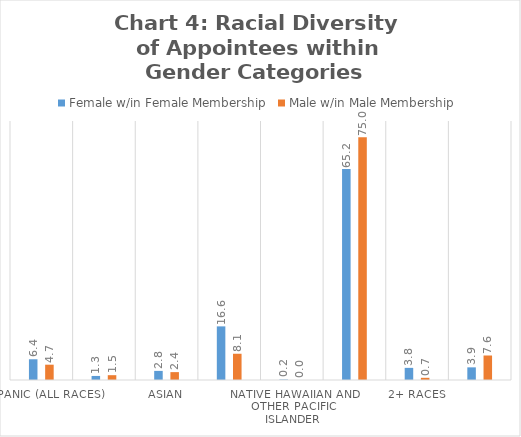
| Category | Female w/in Female Membership | Male w/in Male Membership |
|---|---|---|
| Hispanic (all races) | 6.406 | 4.73 |
| American Indian and Alaskan Native | 1.25 | 1.486 |
| Asian | 2.812 | 2.432 |
| Black and African American (not Hispanic) | 16.562 | 8.108 |
| Native Hawaiian and Other Pacific Islander | 0.156 | 0 |
| White (not Hispanic) | 65.156 | 75 |
| 2+ races | 3.75 | 0.676 |
| Not specified | 3.906 | 7.568 |